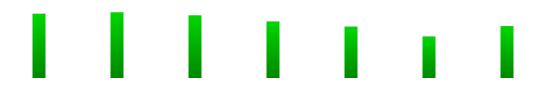
| Category | Series 0 |
|---|---|
| 0 | 1644547 |
| 1 | 1689092 |
| 2 | 1608377 |
| 3 | 1447179 |
| 4 | 1316505 |
| 5 | 1062865 |
| 6 | 1331187 |